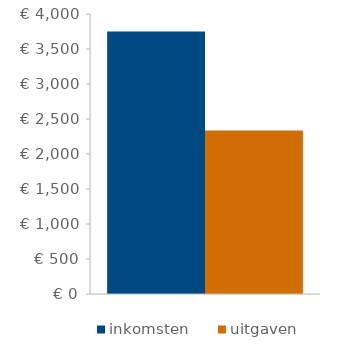
| Category | inkomsten | uitgaven |
|---|---|---|
| 0 | 3750 | 2336 |